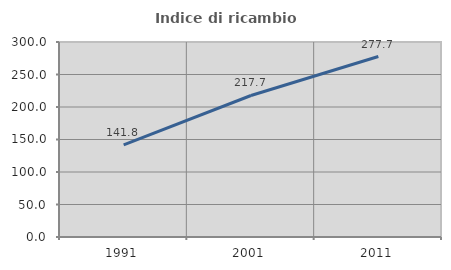
| Category | Indice di ricambio occupazionale  |
|---|---|
| 1991.0 | 141.775 |
| 2001.0 | 217.694 |
| 2011.0 | 277.681 |